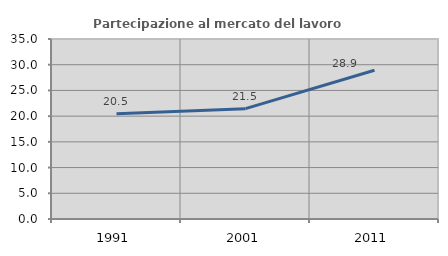
| Category | Partecipazione al mercato del lavoro  femminile |
|---|---|
| 1991.0 | 20.455 |
| 2001.0 | 21.451 |
| 2011.0 | 28.927 |